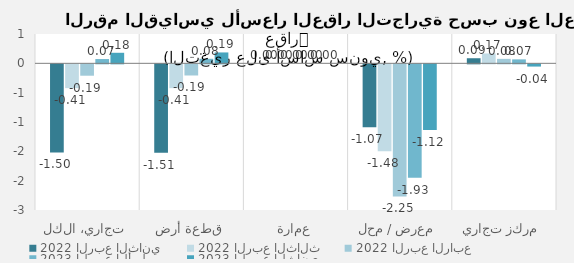
| Category | 2022 | 2023 |
|---|---|---|
| تجاري، الكل | -0.194 | 0.18 |
| قطعة أرض | -0.19 | 0.186 |
| عمارة | 0 | 0 |
| معرض / محل | -2.252 | -1.12 |
| مركز تجاري | 0.076 | -0.038 |